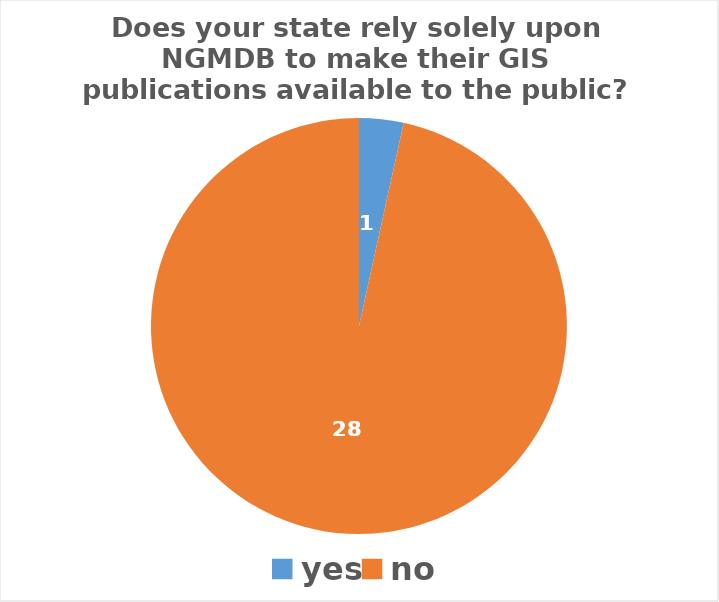
| Category | Series 0 |
|---|---|
| yes | 1 |
| no | 28 |